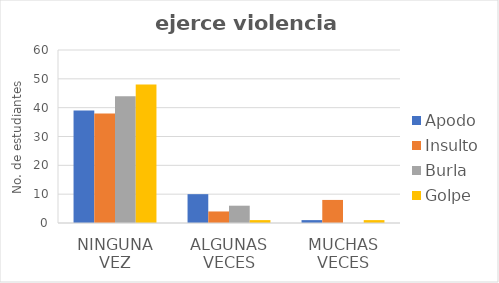
| Category | Apodo | Insulto | Burla | Golpe |
|---|---|---|---|---|
| Ninguna vez | 39 | 38 | 44 | 48 |
| Algunas veces | 10 | 4 | 6 | 1 |
| Muchas veces | 1 | 8 | 0 | 1 |